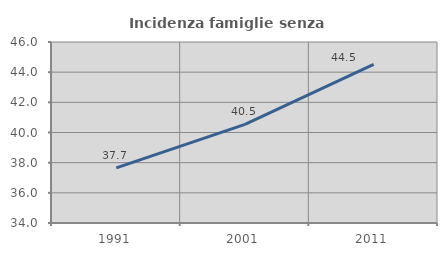
| Category | Incidenza famiglie senza nuclei |
|---|---|
| 1991.0 | 37.654 |
| 2001.0 | 40.541 |
| 2011.0 | 44.516 |